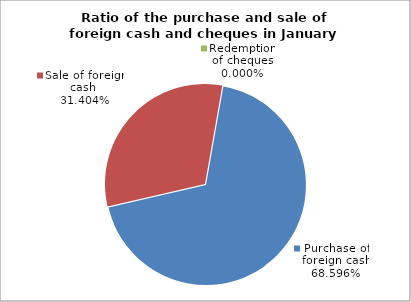
| Category | Purchase of foreign cash | Sale of foreign cash | Redemption of cheques |
|---|---|---|---|
|  | 0.686 | 0.314 | 0 |